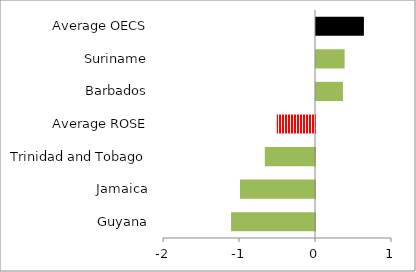
| Category | Series 0 |
|---|---|
| Guyana | -1.104 |
| Jamaica | -0.987 |
| Trinidad and Tobago | -0.66 |
| Average ROSE | -0.503 |
| Barbados | 0.355 |
| Suriname | 0.376 |
| Average OECS | 0.63 |